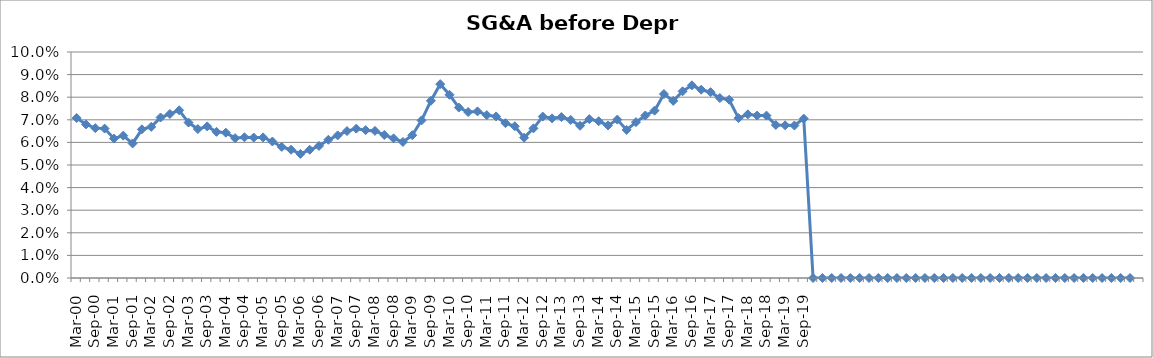
| Category | SG&A (before depr.) % |
|---|---|
| Mar-00 | 0.071 |
| Jun-00 | 0.068 |
| Sep-00 | 0.066 |
| Dec-00 | 0.066 |
| Mar-01 | 0.062 |
| Jun-01 | 0.063 |
| Sep-01 | 0.06 |
| Dec-01 | 0.066 |
| Mar-02 | 0.067 |
| Jun-02 | 0.071 |
| Sep-02 | 0.073 |
| Dec-02 | 0.074 |
| Mar-03 | 0.069 |
| Jun-03 | 0.066 |
| Sep-03 | 0.067 |
| Dec-03 | 0.065 |
| Mar-04 | 0.064 |
| Jun-04 | 0.062 |
| Sep-04 | 0.062 |
| Dec-04 | 0.062 |
| Mar-05 | 0.062 |
| Jun-05 | 0.06 |
| Sep-05 | 0.058 |
| Dec-05 | 0.057 |
| Mar-06 | 0.055 |
| Jun-06 | 0.057 |
| Sep-06 | 0.058 |
| Dec-06 | 0.061 |
| Mar-07 | 0.063 |
| Jun-07 | 0.065 |
| Sep-07 | 0.066 |
| Dec-07 | 0.065 |
| Mar-08 | 0.065 |
| Jun-08 | 0.063 |
| Sep-08 | 0.062 |
| Dec-08 | 0.06 |
| Mar-09 | 0.063 |
| Jun-09 | 0.07 |
| Sep-09 | 0.078 |
| Dec-09 | 0.086 |
| Mar-10 | 0.081 |
| Jun-10 | 0.075 |
| Sep-10 | 0.073 |
| Dec-10 | 0.074 |
| Mar-11 | 0.072 |
| Jun-11 | 0.071 |
| Sep-11 | 0.069 |
| Dec-11 | 0.067 |
| Mar-12 | 0.062 |
| Jun-12 | 0.066 |
| Sep-12 | 0.071 |
| Dec-12 | 0.071 |
| Mar-13 | 0.071 |
| Jun-13 | 0.07 |
| Sep-13 | 0.067 |
| Dec-13 | 0.07 |
| Mar-14 | 0.069 |
| Jun-14 | 0.067 |
| Sep-14 | 0.07 |
| Dec-14 | 0.066 |
| Mar-15 | 0.069 |
| Jun-15 | 0.072 |
| Sep-15 | 0.074 |
| Dec-15 | 0.081 |
| Mar-16 | 0.078 |
| Jun-16 | 0.083 |
| Sep-16 | 0.085 |
| Dec-16 | 0.083 |
| Mar-17 | 0.082 |
| Jun-17 | 0.08 |
| Sep-17 | 0.079 |
| Dec-17 | 0.071 |
| Mar-18 | 0.072 |
| Jun-18 | 0.072 |
| Sep-18 | 0.072 |
| Dec-18 | 0.068 |
| Mar-19 | 0.068 |
| Jun-19 | 0.067 |
| Sep-19 | 0.071 |